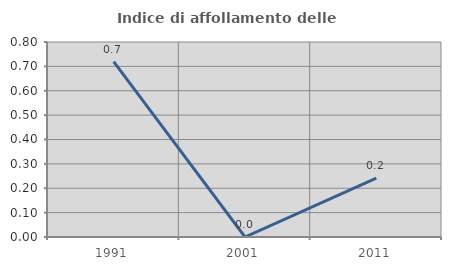
| Category | Indice di affollamento delle abitazioni  |
|---|---|
| 1991.0 | 0.719 |
| 2001.0 | 0 |
| 2011.0 | 0.242 |